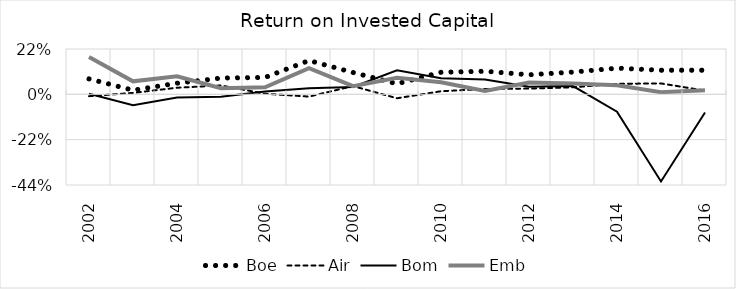
| Category | Boe | Air | Bom | Emb |
|---|---|---|---|---|
| 2002.0 | 0.075 | -0.009 | 0.003 | 0.181 |
| 2003.0 | 0.02 | 0.007 | -0.053 | 0.063 |
| 2004.0 | 0.054 | 0.032 | -0.015 | 0.088 |
| 2005.0 | 0.079 | 0.043 | -0.012 | 0.03 |
| 2006.0 | 0.082 | 0.003 | 0.014 | 0.034 |
| 2007.0 | 0.164 | -0.011 | 0.029 | 0.127 |
| 2008.0 | 0.106 | 0.04 | 0.036 | 0.04 |
| 2009.0 | 0.051 | -0.019 | 0.117 | 0.08 |
| 2010.0 | 0.107 | 0.015 | 0.078 | 0.059 |
| 2011.0 | 0.112 | 0.026 | 0.072 | 0.016 |
| 2012.0 | 0.095 | 0.028 | 0.037 | 0.057 |
| 2013.0 | 0.108 | 0.034 | 0.04 | 0.052 |
| 2014.0 | 0.127 | 0.051 | -0.084 | 0.044 |
| 2015.0 | 0.117 | 0.053 | -0.423 | 0.01 |
| 2016.0 | 0.117 | 0.018 | -0.088 | 0.02 |